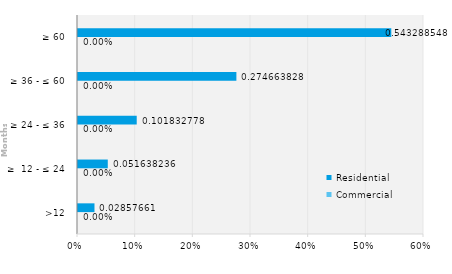
| Category | Commercial | Residential |
|---|---|---|
| >12 | 0 | 0.029 |
| ≥  12 - ≤ 24 | 0 | 0.052 |
| ≥ 24 - ≤ 36 | 0 | 0.102 |
| ≥ 36 - ≤ 60 | 0 | 0.275 |
| ≥ 60 | 0 | 0.543 |